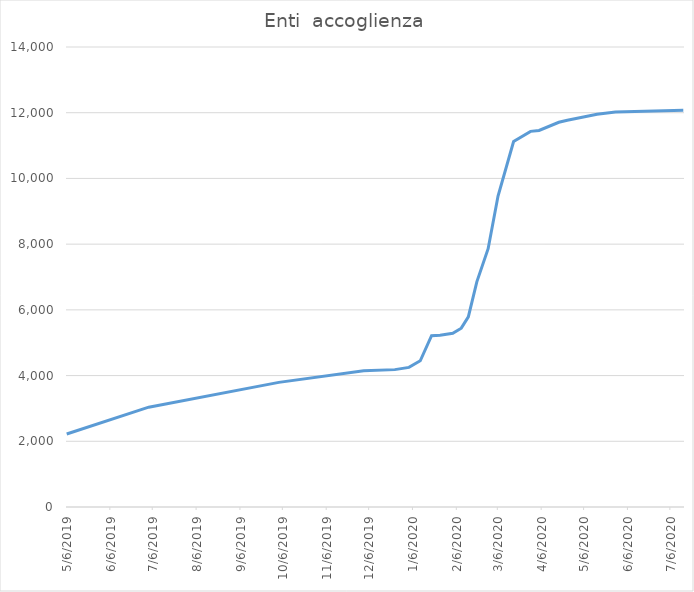
| Category | Enti  accoglienza |
|---|---|
| 5/6/19 | 2223 |
| 7/3/19 | 3038 |
| 10/3/19 | 3793 |
| 12/2/19 | 4149 |
| 12/24/19 | 4181 |
| 1/3/20 | 4249 |
| 1/11/20 | 4450 |
| 1/19/20 | 5214 |
| 1/25/20 | 5229 |
| 2/3/20 | 5285 |
| 2/9/20 | 5443 |
| 2/14/20 | 5787 |
| 2/20/20 | 6854 |
| 2/28/20 | 7861 |
| 3/6/20 | 9465 |
| 3/17/20 | 11122 |
| 3/29/20 | 11433 |
| 4/4/20 | 11460 |
| 4/18/20 | 11710 |
| 4/24/20 | 11770 |
| 5/15/20 | 11953 |
| 5/28/20 | 12025 |
| 7/15/20 | 12072 |